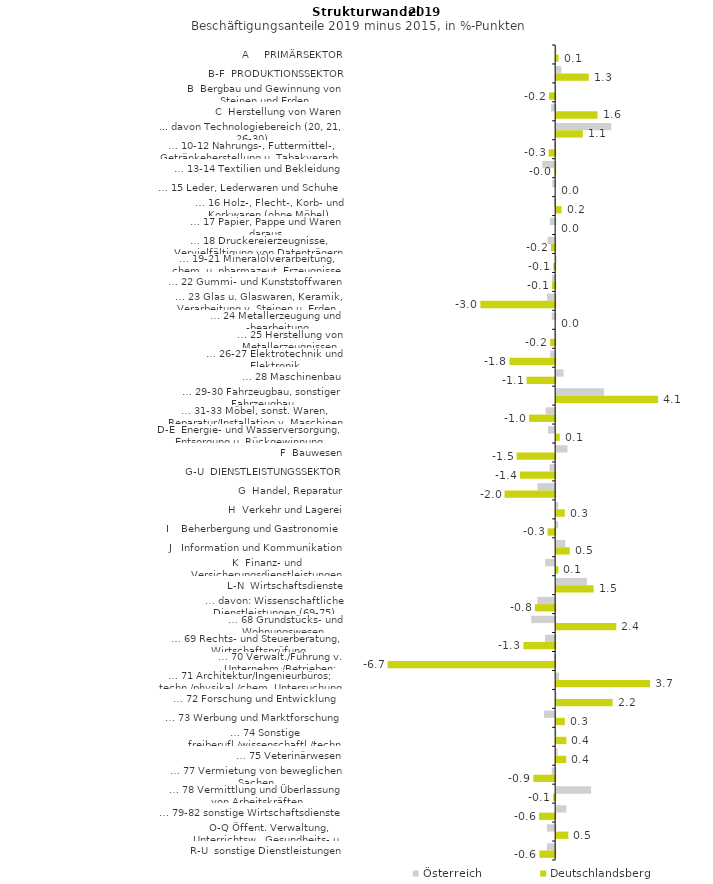
| Category | Österreich | Deutschlandsberg |
|---|---|---|
| A     PRIMÄRSEKTOR | 0.009 | 0.096 |
| B-F  PRODUKTIONSSEKTOR | 0.208 | 1.299 |
| B  Bergbau und Gewinnung von Steinen und Erden | -0.008 | -0.243 |
| C  Herstellung von Waren | -0.159 | 1.645 |
| ... davon Technologiebereich (20, 21, 26-30) | 2.191 | 1.062 |
| … 10-12 Nahrungs-, Futtermittel-, Getränkeherstellung u. Tabakverarb. | -0.044 | -0.258 |
| … 13-14 Textilien und Bekleidung | -0.51 | -0.035 |
| … 15 Leder, Lederwaren und Schuhe | -0.114 | 0 |
| … 16 Holz-, Flecht-, Korb- und Korkwaren (ohne Möbel)  | -0.049 | 0.213 |
| … 17 Papier, Pappe und Waren daraus  | -0.209 | 0 |
| … 18 Druckereierzeugnisse, Vervielfältigung von Datenträgern | -0.302 | -0.168 |
| … 19-21 Mineralölverarbeitung, chem. u. pharmazeut. Erzeugnisse | 0.022 | -0.071 |
| … 22 Gummi- und Kunststoffwaren | -0.128 | -0.127 |
| … 23 Glas u. Glaswaren, Keramik, Verarbeitung v. Steinen u. Erden  | -0.322 | -2.973 |
| … 24 Metallerzeugung und -bearbeitung | -0.136 | 0 |
| … 25 Herstellung von Metallerzeugnissen  | -0.032 | -0.199 |
| … 26-27 Elektrotechnik und Elektronik | -0.193 | -1.816 |
| … 28 Maschinenbau | 0.297 | -1.137 |
| … 29-30 Fahrzeugbau, sonstiger Fahrzeugbau | 1.906 | 4.053 |
| … 31-33 Möbel, sonst. Waren, Reparatur/Installation v. Maschinen | -0.377 | -1.038 |
| D-E  Energie- und Wasserversorgung, Entsorgung u. Rückgewinnung | -0.284 | 0.143 |
| F  Bauwesen | 0.45 | -1.536 |
| G-U  DIENSTLEISTUNGSSEKTOR | -0.217 | -1.4 |
| G  Handel, Reparatur | -0.703 | -2.012 |
| H  Verkehr und Lagerei | 0.083 | 0.346 |
| I    Beherbergung und Gastronomie | 0.078 | -0.302 |
| J   Information und Kommunikation | 0.366 | 0.541 |
| K  Finanz- und Versicherungsdienstleistungen | -0.397 | 0.089 |
| L-N  Wirtschaftsdienste | 1.224 | 1.49 |
| … davon: Wissenschaftliche Dienstleistungen (69-75) | -0.706 | -0.805 |
| … 68 Grundstücks- und Wohnungswesen  | -0.954 | 2.392 |
| … 69 Rechts- und Steuerberatung, Wirtschaftsprüfung | -0.408 | -1.261 |
| … 70 Verwalt./Führung v. Unternehm./Betrieben; Unternehmensberat. | -0.052 | -6.665 |
| … 71 Architektur/Ingenieurbüros; techn./physikal./chem. Untersuchung | 0.116 | 3.736 |
| … 72 Forschung und Entwicklung  | 0.013 | 2.245 |
| … 73 Werbung und Marktforschung | -0.44 | 0.345 |
| … 74 Sonstige freiberufl./wissenschaftl./techn. Tätigkeiten | 0.011 | 0.407 |
| … 75 Veterinärwesen | 0.053 | 0.402 |
| … 77 Vermietung von beweglichen Sachen  | -0.137 | -0.865 |
| … 78 Vermittlung und Überlassung von Arbeitskräften | 1.388 | -0.081 |
| … 79-82 sonstige Wirtschaftsdienste | 0.408 | -0.641 |
| O-Q Öffent. Verwaltung, Unterrichtsw., Gesundheits- u. Sozialwesen | -0.326 | 0.485 |
| R-U  sonstige Dienstleistungen | -0.326 | -0.626 |